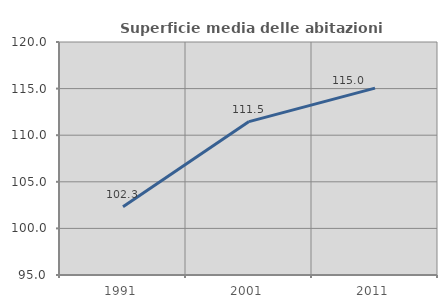
| Category | Superficie media delle abitazioni occupate |
|---|---|
| 1991.0 | 102.326 |
| 2001.0 | 111.461 |
| 2011.0 | 115.047 |